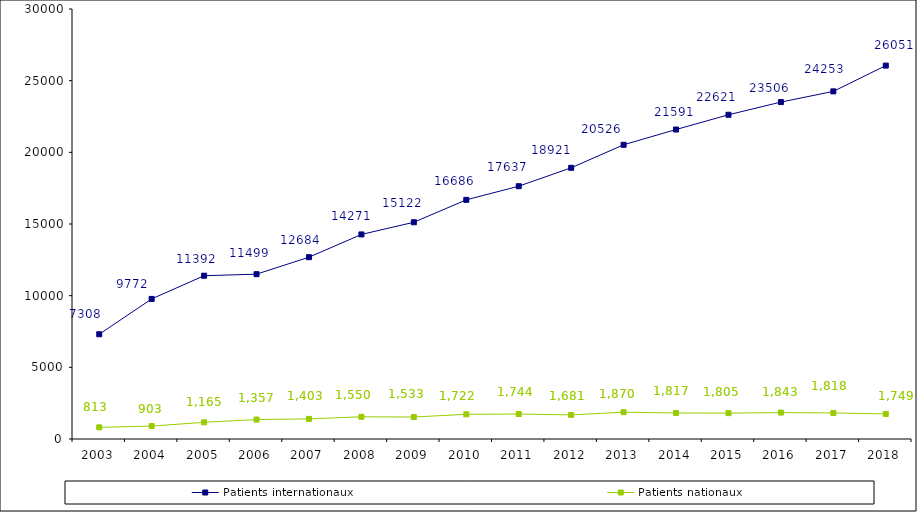
| Category | Patients internationaux | Patients nationaux |
|---|---|---|
| 2003.0 | 7308 | 813 |
| 2004.0 | 9772 | 903 |
| 2005.0 | 11392 | 1165 |
| 2006.0 | 11499 | 1357 |
| 2007.0 | 12684 | 1403 |
| 2008.0 | 14271 | 1550 |
| 2009.0 | 15122 | 1533 |
| 2010.0 | 16686 | 1722 |
| 2011.0 | 17637 | 1744 |
| 2012.0 | 18921 | 1681 |
| 2013.0 | 20526 | 1870 |
| 2014.0 | 21591 | 1817 |
| 2015.0 | 22621 | 1805 |
| 2016.0 | 23506 | 1843 |
| 2017.0 | 24253 | 1818 |
| 2018.0 | 26051 | 1749 |